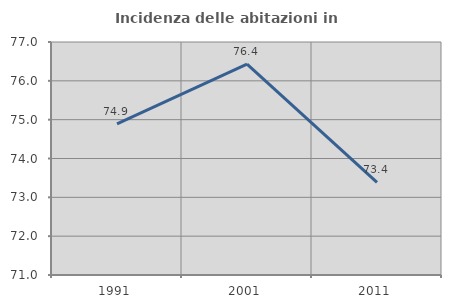
| Category | Incidenza delle abitazioni in proprietà  |
|---|---|
| 1991.0 | 74.891 |
| 2001.0 | 76.43 |
| 2011.0 | 73.385 |